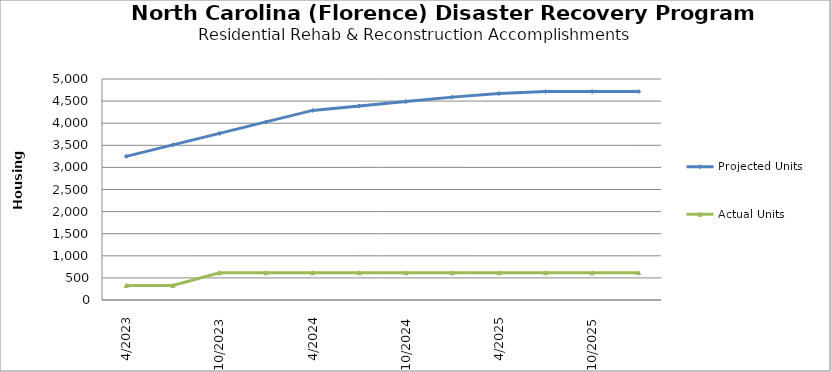
| Category | Projected Units | Actual Units |
|---|---|---|
| 4/2023 | 3250 | 327 |
| 7/2023 | 3510 | 327 |
| 10/2023 | 3770 | 616 |
| 1/2024 | 4030 | 616 |
| 4/2024 | 4290 | 616 |
| 7/2024 | 4390 | 616 |
| 10/2024 | 4490 | 616 |
| 1/2025 | 4590 | 616 |
| 4/2025 | 4670 | 616 |
| 7/2025 | 4715 | 616 |
| 10/2025 | 4715 | 616 |
| 1/2026 | 4715 | 616 |